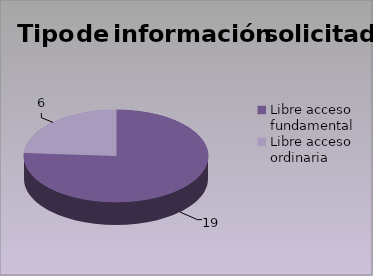
| Category | Series 0 |
|---|---|
| Libre acceso fundamental | 19 |
| Libre acceso ordinaria  | 6 |